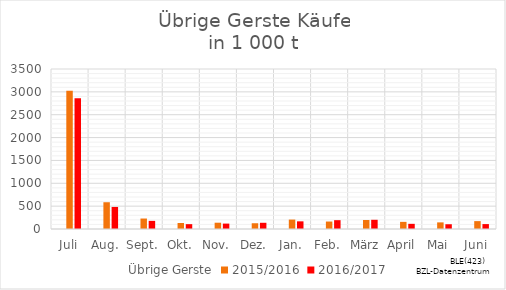
| Category | Übrige Gerste | 2015/2016 | 2016/2017 |
|---|---|---|---|
| Juli |  | 3021.813 | 2860.783 |
| Aug. |  | 585.323 | 482.245 |
| Sept. |  | 228.93 | 177.441 |
| Okt. |  | 131.296 | 105.987 |
| Nov. |  | 137.679 | 118.04 |
| Dez. |  | 125.856 | 135.965 |
| Jan. |  | 206.173 | 167.629 |
| Feb. |  | 163.471 | 193.257 |
| März |  | 197.434 | 201.44 |
| April |  | 156.305 | 113.087 |
| Mai |  | 144.876 | 104.123 |
| Juni |  | 172.361 | 107.38 |